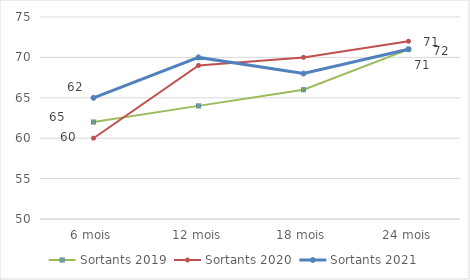
| Category | Sortants 2019 | Sortants 2020 | Sortants 2021 |
|---|---|---|---|
| 6 mois | 62 | 60 | 65 |
| 12 mois | 64 | 69 | 70 |
| 18 mois | 66 | 70 | 68 |
| 24 mois | 71 | 72 | 71 |